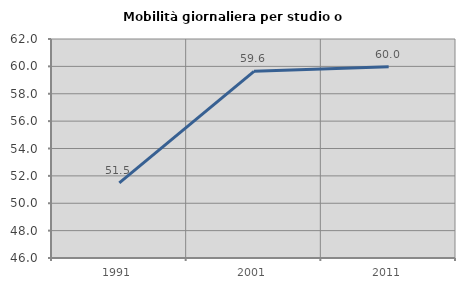
| Category | Mobilità giornaliera per studio o lavoro |
|---|---|
| 1991.0 | 51.489 |
| 2001.0 | 59.638 |
| 2011.0 | 59.97 |